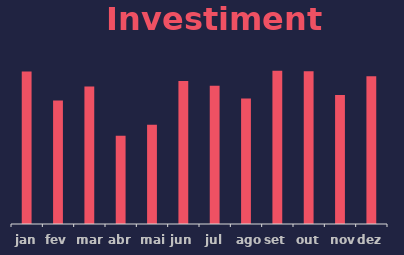
| Category | Series 0 |
|---|---|
| jan | 662823 |
| fev | 536863 |
| mar | 597302 |
| abr | 383188 |
| mai | 431268 |
| jun | 621415 |
| jul | 600937 |
| ago | 545916 |
| set | 666573 |
| out | 664437 |
| nov | 561221 |
| dez | 642632 |